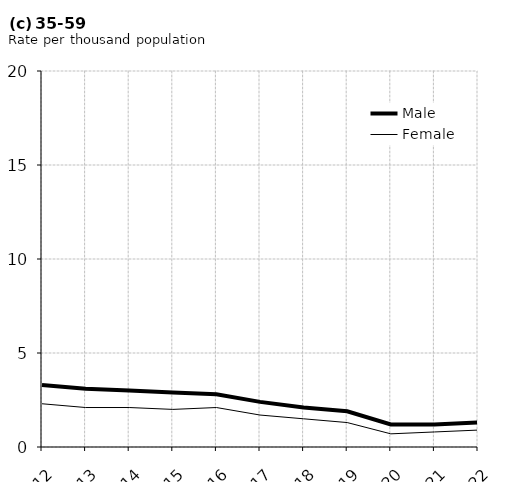
| Category | Male | Female |
|---|---|---|
| 2012.0 | 3.3 | 2.3 |
| 2013.0 | 3.1 | 2.1 |
| 2014.0 | 3 | 2.1 |
| 2015.0 | 2.9 | 2 |
| 2016.0 | 2.8 | 2.1 |
| 2017.0 | 2.4 | 1.7 |
| 2018.0 | 2.1 | 1.5 |
| 2019.0 | 1.9 | 1.3 |
| 2020.0 | 1.2 | 0.7 |
| 2021.0 | 1.2 | 0.8 |
| 2022.0 | 1.3 | 0.9 |